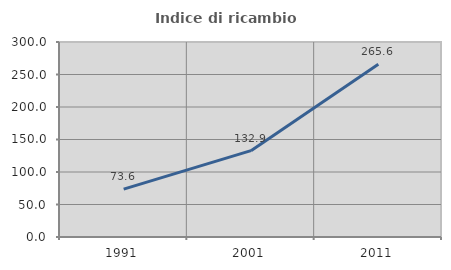
| Category | Indice di ricambio occupazionale  |
|---|---|
| 1991.0 | 73.565 |
| 2001.0 | 132.85 |
| 2011.0 | 265.644 |